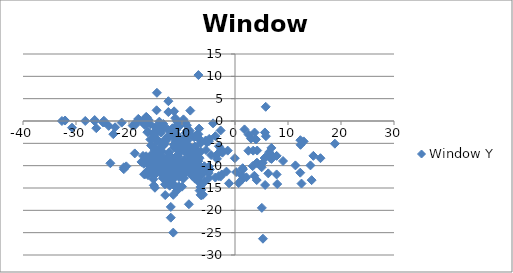
| Category | Window Y |
|---|---|
| -11.49353577871317 | 2.164 |
| -10.969182200841853 | 0.011 |
| -11.283794347564644 | 0.64 |
| -10.549699338544801 | -1.244 |
| -10.759440769693327 | -0.268 |
| -10.654570054119063 | -4.576 |
| -10.23508719182201 | -6.624 |
| -10.23508719182201 | -9.252 |
| -8.646121467227903 | -5.624 |
| -10.5496993385448 | -12.565 |
| -4.903577871316899 | -4.51 |
| -14.832501503307277 | -4.51 |
| -10.42047504509922 | -4.665 |
| -11.194828622970537 | -4.51 |
| -5.323060733613953 | -4.82 |
| -5.5328021647624785 | -4.36 |
| -9.839957907396272 | -4.1 |
| -8.436380036079377 | 2.329 |
| -8.541250751653639 | -2.164 |
| -9.380216476247746 | -4.615 |
| -9.065604329524955 | -2.164 |
| -9.065604329524957 | -0.954 |
| -9.380216476247746 | -0.389 |
| -10.194828622970537 | -11.14 |
| -2.7097414311485277 | -2.114 |
| 2.5571557426337934 | -3.043 |
| 5.835087191822009 | -3.403 |
| -18.78478653036681 | -0.825 |
| -14.751984365604331 | -1.599 |
| -13.977630787733014 | -2.623 |
| -13.522760072158754 | -0.664 |
| -13.832501503307277 | -0.914 |
| -13.727630787733014 | -0.968 |
| -14.542242934455803 | -4.486 |
| -15.316596512327122 | -9.387 |
| -14.542242934455803 | -11.181 |
| -13.458147925435963 | -1.634 |
| -11.42047504509922 | -1.48 |
| -10.181509320505112 | -4.422 |
| -14.033794347564644 | -4.895 |
| -13.2996993385448 | -5.205 |
| -13.583794347564643 | -5.55 |
| -13.683794347564646 | -6.884 |
| -13.059440769693328 | -10.842 |
| -13.16431148526759 | -16.588 |
| -13.678923631990383 | -8.133 |
| -13.369182200841855 | -10.077 |
| -13.004570054119064 | -12.795 |
| -13.214311485267594 | -14.179 |
| -11.410733613950692 | -14.544 |
| -9.986380036079375 | -14.699 |
| -10.596121467227904 | -14.599 |
| -6.5035778713168995 | -14.754 |
| -6.363319302465427 | -15.423 |
| -6.468190018039688 | -16.512 |
| -6.048707155742636 | -16.512 |
| -6.203577871316899 | -16.302 |
| -6.823060733613953 | -13.655 |
| -6.41819001803969 | -14.019 |
| -6.41819001803969 | -14.019 |
| -6.463319302465425 | -6.849 |
| -7.2425435959110045 | -6.659 |
| -7.1925435959110064 | -6.764 |
| -7.19741431148527 | -6.459 |
| -7.19741431148527 | -3.011 |
| -7.552285027059534 | -3.426 |
| -7.702285027059532 | -3.636 |
| -6.773060733613953 | -1.702 |
| -7.09741431148527 | -11.171 |
| -7.562026458208059 | -10.396 |
| -7.757155742633795 | -10.242 |
| -7.6022850270595335 | -10.187 |
| -7.342543595911006 | -10.496 |
| -6.363319302465425 | -16.641 |
| 16.12763078773301 | -8.326 |
| -11.533794347564644 | -5.314 |
| -9.2996993385448 | -5.314 |
| -9.380216476247748 | -5.314 |
| -11.453277209861696 | -5.209 |
| -13.001984365604331 | -4.434 |
| -10.824052916416116 | -5.314 |
| -8.983102826217682 | -4.37 |
| -9.790258568851474 | -5.149 |
| 7.855862898376428 | -7.806 |
| 6.888665063138905 | -7.596 |
| 6.8617257967528555 | -6.023 |
| -6.516897173782324 | -4.999 |
| 4.186380036079372 | -6.612 |
| 14.787372218881536 | -7.806 |
| -10.589957907396274 | -5.104 |
| -10.339957907396274 | -5.668 |
| -10.775345760673483 | -7.532 |
| -10.6496993385448 | -6.773 |
| -9.565604329524957 | -6.733 |
| -10.6496993385448 | -4.58 |
| -10.030216476247748 | -4.225 |
| -8.371767889356587 | -3.076 |
| -12.719182200841853 | -3.491 |
| -4.863319302465425 | -4.015 |
| 3.9571557426337938 | -4.125 |
| 6.446121467227902 | -6.972 |
| 12.364311485267587 | -5.328 |
| -9.348406494287435 | -4.559 |
| -22.963710162357188 | -2.945 |
| -6.927931449188216 | -3.78 |
| 12.961725796752855 | -4.568 |
| 3.6912507516536373 | -2.581 |
| 3.0168971737823194 | -3.934 |
| -6.877931449188216 | -3.934 |
| 12.332501503307274 | -4.299 |
| 18.844527961515336 | -5.078 |
| -15.483794347564643 | -2.745 |
| -22.626337943475647 | -1.402 |
| -26.175045099218288 | -1.606 |
| -30.752976548406494 | -1.502 |
| -11.000992182802166 | -3.005 |
| -11.835087191822009 | -1.731 |
| -12.574052916416116 | 2.006 |
| -14.731208659049909 | 6.313 |
| -12.569182200841851 | 4.433 |
| -10.396121467227903 | -4.225 |
| -9.766897173782322 | -6.443 |
| -12.324052916416116 | -14.493 |
| -12.114311485267592 | -10.371 |
| -12.114311485267592 | -13.584 |
| -12.114311485267592 | -19.235 |
| -12.114311485267592 | -21.644 |
| -11.6496993385448 | -16.533 |
| -11.6496993385448 | -24.986 |
| -11.6496993385448 | -12.844 |
| -11.544828622970536 | -9.266 |
| -11.005862898376432 | -9.116 |
| -9.565604329524957 | -8.656 |
| -10.177931449188215 | -9.681 |
| -12.400992182802167 | -8.492 |
| -11.177931449188215 | -8.592 |
| -11.177931449188215 | -8.492 |
| -10.673060733613951 | -7.948 |
| -10.463319302465424 | -10.895 |
| -3.403878532772103 | -8.472 |
| -4.502585688514732 | -7.638 |
| -8.919482862297055 | -7.383 |
| -8.254870715574263 | -11.36 |
| -8.468190018039689 | -8.496 |
| -7.688965724594107 | -7.722 |
| -8.363319302465424 | -7.877 |
| -0.03180998196031415 | -8.327 |
| -2.370775706554422 | -7.093 |
| -5.479224293445583 | -6.509 |
| -12.250992182802166 | -7.757 |
| -15.235087191822009 | -7.512 |
| 5.235087191822005 | -9.371 |
| 9.058147925435957 | -8.956 |
| 11.397113650030064 | -9.94 |
| 14.236079374624172 | -9.94 |
| 5.799699338544797 | -8.077 |
| 5.58995790739627 | -8.287 |
| 5.2753457606734795 | -26.354 |
| 5.0656043295249535 | -19.45 |
| 7.967889356584484 | -14.113 |
| 5.794828622970531 | 3.18 |
| 5.644828622970533 | -2.571 |
| 6.888665063138905 | -8.487 |
| 6.628923631990373 | -8.282 |
| 4.205862898376424 | -9.411 |
| 4.085087191822005 | -9.371 |
| 2.5253457606734795 | -6.654 |
| 1.4815093205051109 | -10.849 |
| 1.326638604930845 | -13.101 |
| 1.796121467227902 | -1.882 |
| -1.3792242934455818 | -6.633 |
| -3.0328021647624803 | -5.649 |
| 3.432802164762477 | -6.633 |
| -3.702285027059532 | -3.391 |
| -11.204570054119063 | -2.132 |
| -9.275345760673483 | -2.656 |
| -6.903577871316899 | 10.282 |
| -9.72663860493085 | 0.36 |
| -8.121767889356587 | -3.361 |
| -9.775345760673483 | -6.439 |
| -7.573060733613951 | -5.71 |
| -9.439957907396273 | -6.704 |
| -9.175345760673482 | -6.814 |
| -8.610733613950693 | -5.82 |
| -9.489957907396274 | -5.555 |
| -8.202285027059531 | -9.006 |
| -9.37047504509922 | -9.727 |
| -8.500992182802166 | -11.156 |
| -6.913319302465425 | -2.979 |
| -11.085087191822009 | -5.661 |
| -8.092543595911003 | -8.149 |
| -7.277931449188215 | -8.523 |
| -6.908448586891164 | -8.993 |
| -9.955862898376427 | -5.311 |
| -9.954570054119063 | -9.767 |
| -7.882802164762476 | -6.705 |
| -6.898707155742633 | -9.803 |
| -10.975345760673484 | -11.561 |
| -11.499699338544803 | -10.053 |
| -6.434095009019847 | -10.977 |
| -10.975345760673484 | -15.628 |
| -8.636380036079377 | -9.088 |
| -7.273060733613953 | -10.088 |
| -9.346121467227903 | -11.387 |
| -11.930216476247747 | -9.064 |
| -15.593535778713175 | -3.953 |
| -15.394828622970534 | -13.035 |
| -9.754570054119062 | -12.855 |
| -9.909440769693326 | -12.645 |
| -13.622760072158751 | -12.8 |
| -16.416596512327118 | -12.126 |
| -17.147113650030068 | -11.916 |
| -5.766897173782324 | -13.639 |
| -1.1292242934455818 | -13.954 |
| -23.51888153938665 | -9.464 |
| -20.510432952495492 | -10.153 |
| -13.788665063138907 | -10.303 |
| -12.859440769693325 | -10.093 |
| -12.859440769693325 | -9.883 |
| -12.859440769693325 | -10.657 |
| -12.5496993385448 | -10.712 |
| -12.704570054119063 | -11.077 |
| -13.009440769693326 | -11.237 |
| -12.235087191822009 | -11.132 |
| -13.324052916416116 | -10.303 |
| -13.114311485267592 | -10.927 |
| -12.539957907396277 | -10.462 |
| -16.413018641010225 | -11.137 |
| -16.72276007215875 | -11.451 |
| -16.303277209861697 | -11.142 |
| -9.630216476247746 | -12.75 |
| -4.927931449188217 | -12.75 |
| 0.6889657245941074 | -13.899 |
| 4.092543595911002 | -13.229 |
| 12.54840649428743 | -14.008 |
| 14.458147925435956 | -13.239 |
| -8.466897173782321 | -10.667 |
| -10.135087191822011 | -12.44 |
| -6.70228502705953 | -8.334 |
| -6.827931449188217 | -8.085 |
| -15.833794347564645 | -11.182 |
| -9.271767889356587 | -11.501 |
| -10.675345760673483 | -11.761 |
| -10.520475045099218 | -11.916 |
| -16.97276007215875 | -11.916 |
| 1.2633193024654212 | -12.185 |
| 2.142543595911003 | -12.605 |
| -2.7097414311485277 | -12.44 |
| -2.5000000000000018 | -11.976 |
| -6.823060733613953 | -10.887 |
| -6.568190018039688 | -12.54 |
| -10.031509320505112 | -10.267 |
| -9.616897173782322 | -10.112 |
| -9.616897173782322 | -10.787 |
| -10.136380036079375 | -11.206 |
| -17.653277209861695 | -9.168 |
| -17.178923631990383 | -9.583 |
| -20.977630787733016 | -10.362 |
| -20.977630787733016 | -10.782 |
| -9.762026458208059 | -11.606 |
| -10.076638604930848 | -11.396 |
| -6.309741431148527 | -10.677 |
| -6.1 | -10.677 |
| -10.59741431148527 | -11.476 |
| -10.59741431148527 | -11.785 |
| -10.387672880336742 | -11.785 |
| -10.34741431148527 | -11.511 |
| -9.57306073361395 | -11.201 |
| -9.677931449188215 | -11.976 |
| -5.790258568851474 | -10.153 |
| -5.790258568851474 | -10.362 |
| -9.608448586891159 | -10.157 |
| -9.968190018039689 | -10.572 |
| -9.758448586891161 | -10.572 |
| -8.519482862297053 | -11.346 |
| -8.540258568851474 | -11.142 |
| -10.048707155742633 | -10.257 |
| -9.734095009019843 | -9.588 |
| -8.959741431148526 | -11.037 |
| -8.75 | -11.451 |
| -8.120775706554422 | -11.761 |
| -8.056163559831631 | -12.285 |
| -8.270775706554423 | -10.987 |
| -15.324052916416116 | -11.435 |
| -13.754570054119064 | -12.06 |
| -12.130216476247746 | -12.215 |
| -11.21202645820806 | -12.46 |
| -12.47663860493085 | -11.061 |
| -13.970475045099223 | -10.756 |
| -13.925345760673478 | -8.753 |
| -15.164311485267593 | -7.814 |
| -15.224052916416113 | -9.307 |
| -16.260432952495492 | -9.927 |
| -15.319182200841851 | -12.25 |
| -15.328923631990381 | -11.613 |
| -15.783794347564644 | -9.098 |
| -16.038665063138907 | -8.883 |
| -15.259440769693326 | -8.783 |
| -15.574052916416116 | -9.712 |
| -13.164311485267591 | -10.142 |
| -15.054570054119065 | -8.783 |
| -15.414311485267593 | -8.833 |
| -15.51431148526759 | -10.112 |
| -15.883794347564642 | -10.492 |
| -15.259440769693326 | -10.956 |
| -15.154570054119063 | -8.583 |
| -13.881509320505115 | -8.938 |
| -15.775345760673483 | -7.525 |
| -15.250992182802166 | -7.944 |
| -14.94125075165364 | -6.65 |
| -14.43150932050511 | -6.495 |
| -15.360733613950693 | -7.794 |
| -15.670475045099218 | -7.794 |
| -15.825345760673484 | -7.794 |
| -15.944828622970535 | -8.414 |
| -15.630216476247744 | -8.833 |
| -15.630216476247744 | -8.833 |
| -16.094828622970535 | -8.833 |
| -16.314311485267588 | -8.509 |
| -16.769182200841858 | -7.889 |
| -15.73021647624775 | -7.994 |
| -13.896121467227903 | -9.912 |
| -14.710733613950692 | -8.049 |
| -14.710733613950692 | -8.414 |
| -15.020475045099223 | -8.364 |
| -14.865604329524958 | -7.075 |
| -14.865604329524958 | -8.883 |
| -15.794828622970535 | -8.783 |
| -15.175345760673478 | -8.628 |
| -15.485087191822009 | -8.783 |
| -15.485087191822009 | -8.783 |
| -15.485087191822009 | -8.783 |
| -14.499699338544797 | -6.595 |
| -15.325345760673484 | -10.642 |
| -16.524052916416114 | -8.988 |
| -15.974052916416113 | -8.323 |
| -15.774052916416114 | -10.046 |
| -15.464311485267594 | -10.201 |
| -15.109440769693332 | -9.777 |
| -15.459440769693325 | -9.617 |
| -14.849699338544802 | -9.772 |
| -15.149699338544805 | -9.932 |
| -14.789957907396271 | -10.656 |
| -15.559440769693328 | -9.098 |
| -15.659440769693322 | -9.098 |
| -15.360733613950693 | -7.33 |
| -15.599699338544802 | -9.253 |
| -17.35814792543596 | -7.814 |
| -18.906855081178595 | -7.259 |
| -15.8496993385448 | -5.471 |
| -15.489957907396269 | -9.223 |
| -15.974052916416113 | -4.136 |
| -16.543535778713174 | -2.506 |
| -16.37405291641612 | -2.452 |
| -16.58379434756465 | -0.603 |
| -16.274052916416114 | 0.221 |
| -14.277630787733013 | -0.148 |
| -16.583794347564645 | 0.686 |
| -16.77892363199038 | 0.791 |
| -17.2532772098617 | 0.167 |
| -12.659140108238127 | -1.926 |
| -15.00784726398076 | -1.406 |
| -23.82832230907998 | -1.092 |
| -24.905261575466024 | -0.308 |
| -24.67474443776308 | -0.308 |
| -15.986079374624175 | -0.727 |
| -17.028622970535178 | -0.677 |
| -17.028622970535178 | -0.467 |
| -17.028622970535178 | -0.887 |
| -17.26888153938665 | -0.358 |
| -18.767588695129284 | -0.363 |
| -18.088364401683705 | 0.262 |
| -18.24323511725797 | 0.471 |
| -19.296812988574867 | -1.037 |
| -21.376037282020448 | -0.363 |
| -24.739356584485872 | 0.057 |
| -26.473451593505715 | 0.212 |
| -26.473451593505715 | -0.048 |
| -28.252675886951295 | 0.002 |
| -32.0562537582682 | 0.107 |
| -32.65138304269393 | -0.003 |
| -16.74840649428743 | 0.941 |
| -16.014311485267584 | -8.888 |
| -12.477931449188215 | -7.044 |
| -14.589957907396274 | -9.512 |
| -16.259440769693327 | -8.318 |
| -14.091250751653641 | -5.995 |
| -6.745129284425737 | -10.117 |
| -11.168190018039686 | -14.679 |
| -12.866897173782327 | -8.073 |
| -11.577931449188213 | -3.402 |
| -11.882802164762477 | -2.088 |
| -11.777931449188213 | -1.624 |
| -12.34741431148527 | -3.411 |
| -11.253577871316898 | -1.624 |
| -11.823060733613952 | -3.447 |
| -10.888965724594108 | -3.537 |
| -11.513319302465426 | -5.965 |
| -13.131509320505115 | -4.081 |
| -14.900992182802161 | -3.926 |
| -14.62663860493085 | -2.363 |
| -14.62663860493085 | -2.363 |
| -14.796121467227906 | -2.103 |
| -14.79125075165364 | 2.399 |
| -15.315604329524957 | -14.405 |
| -15.100992182802166 | -14.944 |
| -15.155862898376432 | -7.18 |
| -15.246121467227907 | -7.854 |
| -14.421467227901385 | -10.037 |
| -13.935087191822008 | -9.043 |
| -14.965604329524952 | -8.518 |
| -14.220475045099223 | -8.673 |
| -14.946121467227906 | -7.949 |
| -15.000992182802166 | -8.438 |
| -15.155862898376432 | -6.515 |
| -14.22663860493085 | -6.915 |
| -15.155862898376427 | -5.931 |
| -8.159741431148525 | -10.622 |
| -7.699999999999999 | -11.142 |
| -8.834095009019844 | -10.617 |
| -11.648707155742633 | -9.998 |
| -11.648707155742633 | -9.998 |
| -11.648707155742633 | -10.617 |
| -11.858448586891159 | -9.378 |
| -12.423060733613951 | -9.843 |
| -12.423060733613951 | -9.843 |
| -12.487672880336742 | -10.412 |
| -11.748707155742633 | -11.356 |
| -11.908448586891163 | -10.832 |
| -11.753577871316898 | -11.356 |
| -11.803577871316898 | -10.832 |
| -14.77047504509922 | -11.037 |
| -9.938965724594107 | -10.887 |
| 3.6535778713168945 | -12.255 |
| 12.31301864101022 | -11.573 |
| -12.482802164762475 | -9.998 |
| -13.357155742633793 | -9.998 |
| -12.52306073361395 | -10.722 |
| -13.571767889356584 | -10.617 |
| -12.797414311485266 | -10.617 |
| -12.797414311485266 | -10.617 |
| -13.262026458208059 | -10.617 |
| -13.881509320505115 | -11.082 |
| -12.52306073361395 | -11.392 |
| -12.52306073361395 | -11.392 |
| -13.087672880336742 | -10.153 |
| -13.79125075165364 | -9.943 |
| -7.753577871316899 | -8.029 |
| -7.1340950090198465 | -11.106 |
| -12.253277209861697 | -3.248 |
| -5.612026458208059 | -10.522 |
| -4.136680697534578 | -0.527 |
| -5.610733613950693 | -11.051 |
| -13.097414311485267 | -11.916 |
| -12.013319302465424 | -11.666 |
| -12.013319302465424 | -11.666 |
| -12.013319302465424 | -11.666 |
| -12.013319302465424 | -11.821 |
| -12.223060733613952 | -11.666 |
| -12.47793144918821 | -11.666 |
| -12.013319302465424 | -11.821 |
| -11.953577871316893 | -11.976 |
| -12.632802164762477 | -10.093 |
| -12.47793144918821 | -10.867 |
| -12.477931449188215 | -10.557 |
| -12.16819001803969 | -10.557 |
| -12.692543595911008 | -12.655 |
| -12.47793144918821 | -12.965 |
| -12.32306073361395 | -13.274 |
| -12.108448586891159 | -11.766 |
| -12.263319302465424 | -12.131 |
| -13.407155742633794 | -11.821 |
| -11.298707155742633 | -12.131 |
| -12.37793144918821 | -12.905 |
| -13.61689717378232 | -11.821 |
| -12.642543595911008 | -12.345 |
| -12.327931449188217 | -12.031 |
| -12.327931449188217 | -12.805 |
| -12.327931449188217 | -12.805 |
| -11.977931449188219 | -12.96 |
| -12.907155742633796 | -9.838 |
| -12.907155742633796 | -10.148 |
| -13.216897173782327 | -10.148 |
| -13.216897173782327 | -10.148 |
| -13.681509320505112 | -10.457 |
| -13.062026458208061 | -10.457 |
| -13.062026458208061 | -10.407 |
| -13.371767889356587 | -12.626 |
| -13.216897173782327 | -9.128 |
| -13.216897173782327 | -10.367 |
| -13.062026458208061 | -10.367 |
| -12.947414311485268 | -10.057 |
| -13.257155742633792 | -11.296 |
| -9.198707155742635 | -10.248 |
| -8.679224293445582 | -11.487 |
| -8.679224293445586 | -10.867 |
| -9.298707155742637 | -10.093 |
| -3.5074564040889973 | -7.701 |
| -3.3025856885147333 | -7.392 |
| -2.5684906794948903 | -6.403 |
| -8.364612146722793 | -11.666 |
| -7.874353577871316 | -10.777 |
| -8.438965724594107 | -10.617 |
| -8.124353577871318 | -10.617 |
| -7.559741431148527 | -12.905 |
| -8.698707155742635 | -18.635 |
| -3.067197835237524 | -12.321 |
| -10.98508719182201 | -10.932 |
| -8.250000000000002 | -10.617 |
| -8.619482862297053 | -11.237 |
| -8.150000000000002 | -11.546 |
| -7.035387853277211 | -12.011 |
| -6.675646422128683 | -15.586 |
| -9.627931449188214 | -10.617 |
| -5.801292844257368 | -10.153 |
| -7.769482862297053 | -11.082 |
| -8.524353577871318 | -9.673 |
| -9.3035778713169 | -11.392 |
| -8.83896572459411 | -10.303 |
| -8.88896572459411 | -10.303 |
| -11.877931449188214 | -11.077 |
| -12.65228502705953 | -10.717 |
| -11.977931449188219 | -10.157 |
| -11.882802164762477 | -8.58 |
| -13.100992182802166 | -9.948 |
| 1.449699338544797 | -10.567 |
| -8.615904990980157 | -10.462 |
| -4.9343956704750465 | -10.203 |
| -7.929224293445585 | -10.467 |
| 5.027330126277809 | -10.362 |
| -8.19771497294047 | -10.048 |
| -14.893836440168368 | -9.943 |
| -15.111034275405895 | -9.728 |
| -13.297414311485266 | -9.378 |
| -15.79125075165364 | -10.098 |
| -13.432802164762482 | -10.617 |
| -11.129224293445581 | -10.512 |
| 0.2191822008418498 | -11.442 |
| -1.6100420926037318 | -11.337 |
| 3.332501503307273 | -10.103 |
| -11.99741431148527 | -10.827 |
| -14.049699338544801 | -11.032 |
| -12.137672880336744 | -11.756 |
| -12.137672880336744 | -9.433 |
| -12.252285027059536 | -9.743 |
| -12.542543595911008 | -11.916 |
| -12.971767889356586 | -9.009 |
| -12.66202645820806 | -9.164 |
| -12.407155742633796 | -9.993 |
| -12.562026458208061 | -10.517 |
| 6.274052916416117 | -11.726 |
| -12.19741431148527 | -10.057 |
| -13.265604329524955 | -10.257 |
| -12.796121467227904 | -10.987 |
| -12.047414311485266 | -13.524 |
| -12.776638604930852 | -12.476 |
| 5.685387853277213 | -14.323 |
| 7.854269392663859 | -11.966 |
| -5.8587492483463635 | -11.501 |
| -4.742844257366211 | -10.872 |
| -4.9512928442573685 | -11.651 |
| -3.7058628983764272 | -12.655 |
| -10.736680697534576 | -9.633 |
| -10.761034275405892 | -9.843 |
| -11.548707155742633 | -12.69 |
| -10.154870715574265 | -10.248 |